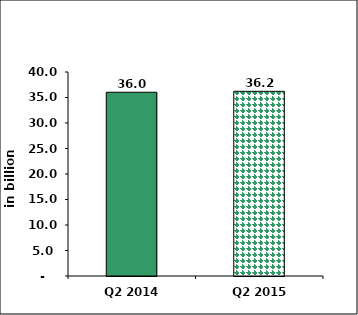
| Category | Series 0 |
|---|---|
| Q2 2014 | 36.031 |
| Q2 2015 | 36.211 |